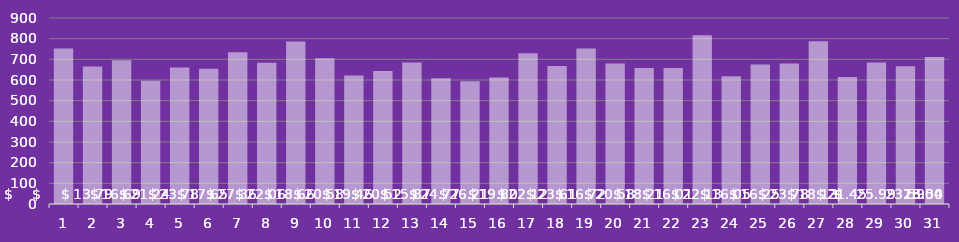
| Category | New Leads |
|---|---|
| 1.0 | 752 |
| 2.0 | 665 |
| 3.0 | 695 |
| 4.0 | 596 |
| 5.0 | 660 |
| 6.0 | 655 |
| 7.0 | 734 |
| 8.0 | 683 |
| 9.0 | 786 |
| 10.0 | 705 |
| 11.0 | 622 |
| 12.0 | 643 |
| 13.0 | 685 |
| 14.0 | 608 |
| 15.0 | 594 |
| 16.0 | 612 |
| 17.0 | 730 |
| 18.0 | 668 |
| 19.0 | 752 |
| 20.0 | 680 |
| 21.0 | 658 |
| 22.0 | 658 |
| 23.0 | 816 |
| 24.0 | 618 |
| 25.0 | 675 |
| 26.0 | 680 |
| 27.0 | 788 |
| 28.0 | 614 |
| 29.0 | 685 |
| 30.0 | 667 |
| 31.0 | 711 |